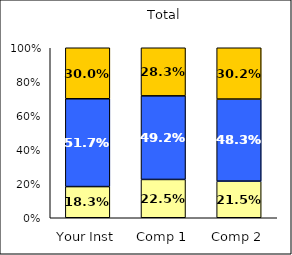
| Category | Low Sense of Belonging | Average Sense of Belonging | High Sense of Belonging |
|---|---|---|---|
| Your Inst | 0.183 | 0.517 | 0.3 |
| Comp 1 | 0.225 | 0.492 | 0.283 |
| Comp 2 | 0.215 | 0.483 | 0.302 |